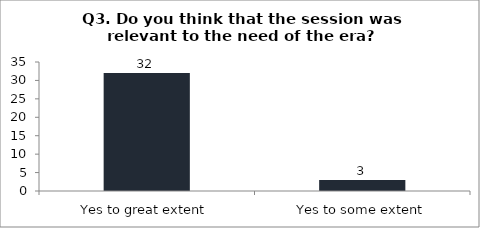
| Category | Q3. Do you think that the session was relevant to the need of the era? |
|---|---|
| Yes to great extent | 32 |
| Yes to some extent | 3 |